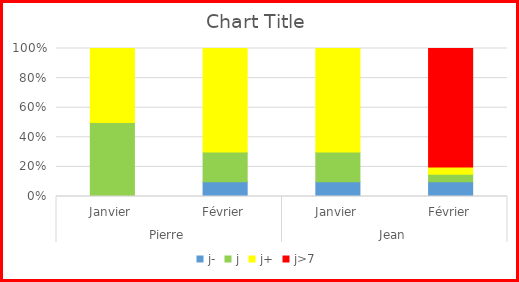
| Category | j- | j | j+ | j>7 |
|---|---|---|---|---|
| 0 | 0 | 50 | 50 | 0 |
| 1 | 10 | 20 | 70 | 0 |
| 2 | 10 | 20 | 70 | 0 |
| 3 | 10 | 5 | 5 | 80 |